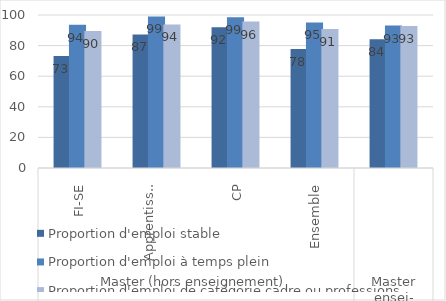
| Category | Proportion d'emploi stable | Proportion d'emploi à temps plein | Proportion d'emploi de catégorie cadre ou professions intermédiaires |
|---|---|---|---|
| 0 | 73.19 | 93.56 | 89.5 |
| 1 | 87.28 | 99.02 | 93.81 |
| 2 | 91.97 | 98.55 | 95.74 |
| 3 | 77.85 | 95.12 | 90.93 |
| 4 | 84.1 | 93.07 | 92.85 |